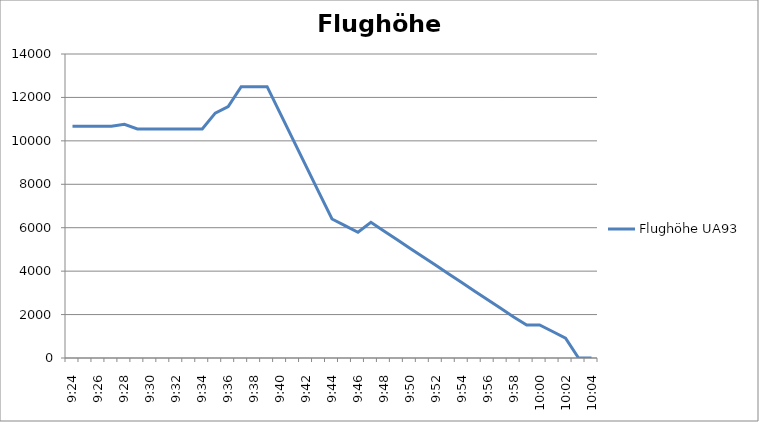
| Category | Flughöhe UA93 |
|---|---|
| 0.391666666666667 | 10668 |
| 0.392361111111111 | 10668 |
| 0.393055555555556 | 10668 |
| 0.39375 | 10668 |
| 0.39444444444444443 | 10759.44 |
| 0.3951388888888889 | 10546.08 |
| 0.395833333333333 | 10546.08 |
| 0.396527777777778 | 10546.08 |
| 0.397222222222222 | 10546.08 |
| 0.397916666666667 | 10546.08 |
| 0.3986111111111111 | 10546.08 |
| 0.3993055555555556 | 11277.6 |
| 0.39999999999999997 | 11582.4 |
| 0.40069444444444446 | 12496.8 |
| 0.401388888888889 | 12496.8 |
| 0.40208333333333335 | 12496.8 |
| 0.40277777777777773 | 11277.6 |
| 0.40347222222222223 | 10058.4 |
| 0.404166666666667 | 8839.2 |
| 0.404861111111111 | 7620 |
| 0.405555555555556 | 6400.8 |
| 0.40625 | 6096 |
| 0.406944444444445 | 5791.2 |
| 0.4076388888888889 | 6248.4 |
| 0.408333333333333 | 5852.16 |
| 0.409027777777777 | 5455.92 |
| 0.409722222222221 | 5059.68 |
| 0.410416666666664 | 4663.44 |
| 0.411111111111108 | 4267.2 |
| 0.411805555555552 | 3870.96 |
| 0.412499999999996 | 3474.72 |
| 0.41319444444444 | 3078.48 |
| 0.413888888888884 | 2682.24 |
| 0.414583333333328 | 2286 |
| 0.415277777777772 | 1889.76 |
| 0.415972222222216 | 1524 |
| 0.41666666666666 | 1524 |
| 0.417361111111104 | 1219.2 |
| 0.418055555555548 | 914.4 |
| 0.418749999999992 | 0 |
| 0.419444444444436 | 0 |